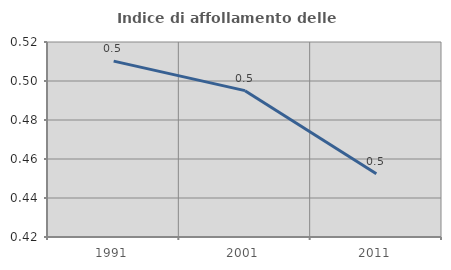
| Category | Indice di affollamento delle abitazioni  |
|---|---|
| 1991.0 | 0.51 |
| 2001.0 | 0.495 |
| 2011.0 | 0.452 |